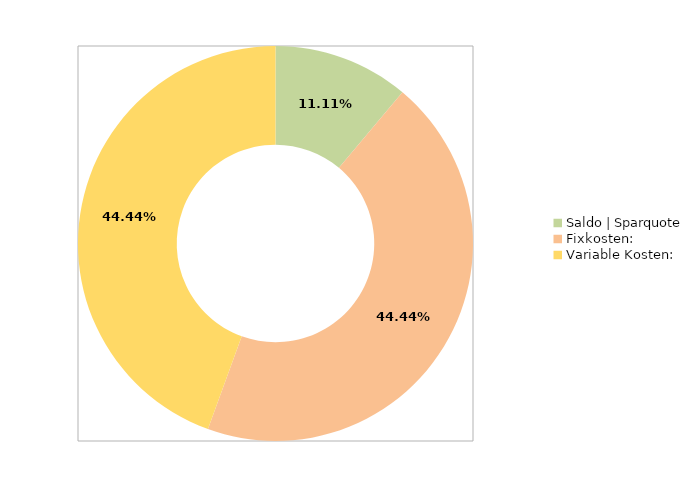
| Category | Series 0 |
|---|---|
| Saldo | Sparquote | 0.111 |
| Fixkosten: | 0.444 |
| Variable Kosten: | 0.444 |